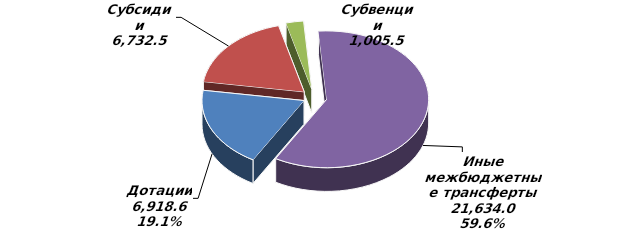
| Category | Series 0 | Series 1 |
|---|---|---|
| Дотации | 6918.6 | 0.191 |
| Субсидии | 6732.5 | 0.186 |
| Субвенции | 1005.5 | 0.028 |
| Иные межбюджетные трансферты | 21634 | 0.596 |